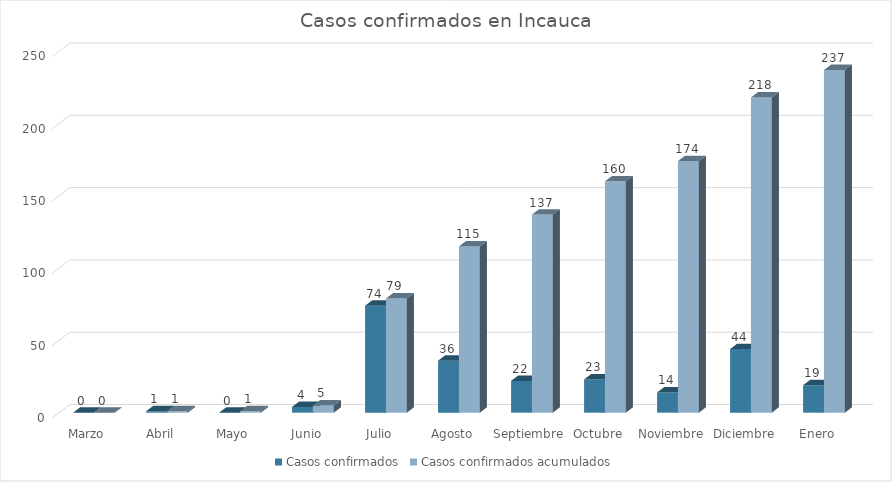
| Category | Casos confirmados | Casos confirmados acumulados |
|---|---|---|
| Marzo | 0 | 0 |
| Abril | 1 | 1 |
| Mayo | 0 | 1 |
| Junio | 4 | 5 |
| Julio | 74 | 79 |
| Agosto | 36 | 115 |
| Septiembre | 22 | 137 |
| Octubre | 23 | 160 |
| Noviembre | 14 | 174 |
| Diciembre | 44 | 218 |
| Enero | 19 | 237 |